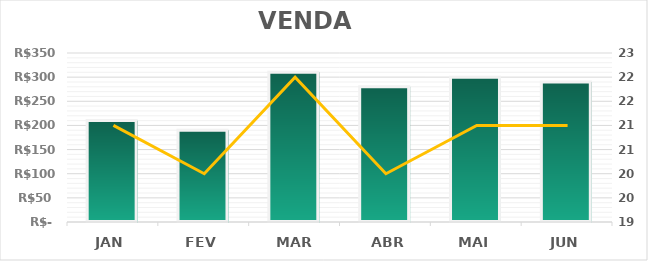
| Category | Series 0 |
|---|---|
| JAN | 210 |
| FEV | 190 |
| MAR | 310 |
| ABR | 280 |
| MAI | 300 |
| JUN | 290 |